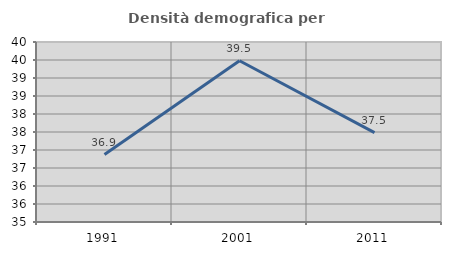
| Category | Densità demografica |
|---|---|
| 1991.0 | 36.873 |
| 2001.0 | 39.479 |
| 2011.0 | 37.482 |